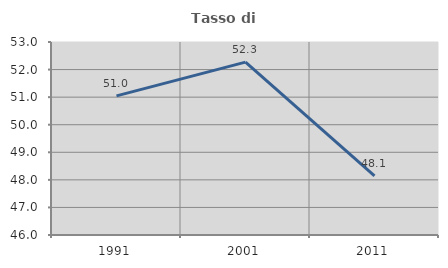
| Category | Tasso di occupazione   |
|---|---|
| 1991.0 | 51.048 |
| 2001.0 | 52.269 |
| 2011.0 | 48.147 |